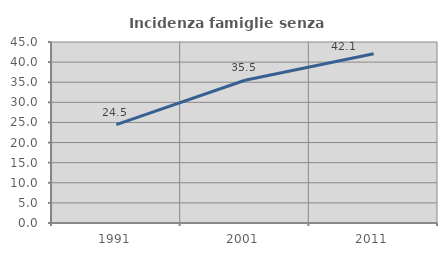
| Category | Incidenza famiglie senza nuclei |
|---|---|
| 1991.0 | 24.457 |
| 2001.0 | 35.488 |
| 2011.0 | 42.087 |